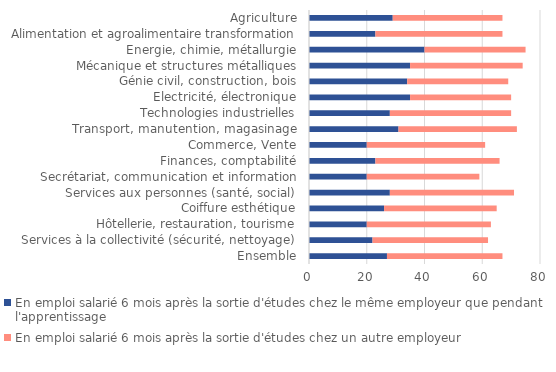
| Category | En emploi salarié 6 mois après la sortie d'études chez le même employeur que pendant l'apprentissage | En emploi salarié 6 mois après la sortie d'études chez un autre employeur |
|---|---|---|
| Ensemble | 27 | 40 |
| Services à la collectivité (sécurité, nettoyage) | 22 | 40 |
| Hôtellerie, restauration, tourisme | 20 | 43 |
| Coiffure esthétique | 26 | 39 |
| Services aux personnes (santé, social) | 28 | 43 |
| Secrétariat, communication et information | 20 | 39 |
| Finances, comptabilité | 23 | 43 |
| Commerce, Vente | 20 | 41 |
| Transport, manutention, magasinage | 31 | 41 |
| Technologies industrielles | 28 | 42 |
| Electricité, électronique | 35 | 35 |
| Génie civil, construction, bois | 34 | 35 |
| Mécanique et structures métalliques | 35 | 39 |
| Energie, chimie, métallurgie | 40 | 35 |
| Alimentation et agroalimentaire transformation | 23 | 44 |
| Agriculture | 29 | 38 |